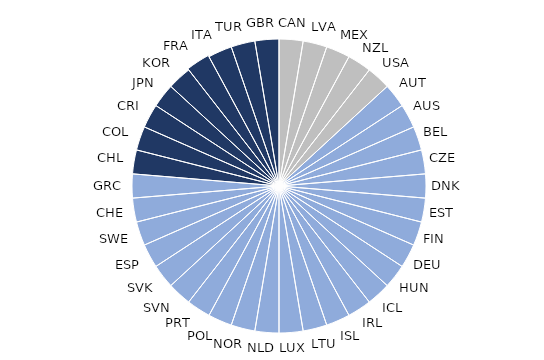
| Category | Series 0 |
|---|---|
| CAN | 1 |
| LVA | 1 |
| MEX | 1 |
| NZL | 1 |
| USA | 1 |
| AUT | 1 |
| AUS | 1 |
| BEL | 1 |
| CZE | 1 |
| DNK | 1 |
| EST | 1 |
| FIN | 1 |
| DEU | 1 |
| HUN | 1 |
| ICL | 1 |
| IRL | 1 |
| ISL | 1 |
| LTU | 1 |
| LUX | 1 |
| NLD | 1 |
| NOR | 1 |
| POL | 1 |
| PRT | 1 |
| SVN | 1 |
| SVK | 1 |
| ESP | 1 |
| SWE | 1 |
| CHE | 1 |
| GRC | 1 |
| CHL | 1 |
| COL | 1 |
| CRI | 1 |
| JPN | 1 |
| KOR | 1 |
| FRA | 1 |
| ITA | 1 |
| TUR | 1 |
| GBR | 1 |